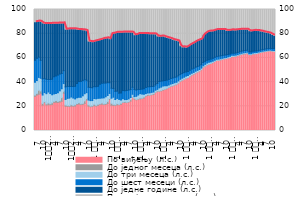
| Category | По виђењу (л.с.) | До једног месеца (л.с.) | До три месеца (л.с.) | До шест месеци (л.с.) | До једне године (л.с.) | Преко једне године (л.с.) |
|---|---|---|---|---|---|---|
| 7 | 28.279 | 1.038 | 10.505 | 18.148 | 31.881 | 10.149 |
| 8 | 29.286 | 1.395 | 10.601 | 18.352 | 30.521 | 9.846 |
| 9 | 29.936 | 3.357 | 10.585 | 16.745 | 29.857 | 9.521 |
| 10 | 30.762 | 1.945 | 10.467 | 14.811 | 32.198 | 9.816 |
| 11 | 20.962 | 1.388 | 6.962 | 13.356 | 46.235 | 11.096 |
| 12 | 23.02 | 0.805 | 7.524 | 11.654 | 45.412 | 11.585 |
| 1
2010. | 21.184 | 0.862 | 8.383 | 11.805 | 46.16 | 11.607 |
| 2 | 21.285 | 1.518 | 9.023 | 10.306 | 46.286 | 11.582 |
| 3 | 21.353 | 0.764 | 8.408 | 11.641 | 46.328 | 11.506 |
| 4 | 21.585 | 1.353 | 6.589 | 12.873 | 46.197 | 11.403 |
| 5 | 23.286 | 0.798 | 6.168 | 14.169 | 44.157 | 11.422 |
| 6 | 23.341 | 1.493 | 5.771 | 14.416 | 43.569 | 11.41 |
| 7 | 23.266 | 0.792 | 7.141 | 14.603 | 42.947 | 11.251 |
| 8 | 23.556 | 1.062 | 8.13 | 13.918 | 42.118 | 11.216 |
| 9 | 24.199 | 2.96 | 7.335 | 12.68 | 41.657 | 11.169 |
| 10 | 30.781 | 1.657 | 6.345 | 10.666 | 39.535 | 11.016 |
| 11 | 20.049 | 1.06 | 4.561 | 10.389 | 47.655 | 16.287 |
| 12 | 20.06 | 0.573 | 5.917 | 9.959 | 47.405 | 16.085 |
| 1
2011. | 19.864 | 0.622 | 6.295 | 9.608 | 47.67 | 15.943 |
| 2 | 20.198 | 1.13 | 6.365 | 8.725 | 47.77 | 15.812 |
| 3 | 20.171 | 0.597 | 6.052 | 9.5 | 47.72 | 15.959 |
| 4 | 20.249 | 1.04 | 4.829 | 10.403 | 47.516 | 15.964 |
| 5 | 21.789 | 0.608 | 4.643 | 11.827 | 44.827 | 16.306 |
| 6 | 21.864 | 1.087 | 4.495 | 12.991 | 43.019 | 16.542 |
| 7 | 21.462 | 0.601 | 5.41 | 13.112 | 42.852 | 16.563 |
| 8 | 21.665 | 0.725 | 6.276 | 12.588 | 41.999 | 16.746 |
| 9 | 22.386 | 2.094 | 5.892 | 11.627 | 41.128 | 16.873 |
| 10 | 25.216 | 1.101 | 4.966 | 10.237 | 41.045 | 17.434 |
| 11 | 20.208 | 0.983 | 4.029 | 10.56 | 38.134 | 26.086 |
| 12 | 19.658 | 0.578 | 4.46 | 10.797 | 38.104 | 26.404 |
| 1 
2012. | 19.907 | 0.608 | 4.223 | 10.568 | 38.056 | 26.639 |
| 2 | 20.572 | 1.122 | 4.734 | 9.87 | 37.577 | 26.124 |
| 3 | 20.284 | 0.534 | 5.362 | 10.002 | 38.101 | 25.718 |
| 4 | 20.768 | 0.945 | 4.856 | 9.95 | 38.185 | 25.295 |
| 5 | 21.629 | 0.577 | 4.354 | 11.593 | 36.949 | 24.898 |
| 6 | 21.75 | 0.97 | 4.139 | 12.16 | 36.576 | 24.405 |
| 7 | 21.485 | 0.49 | 4.995 | 12.244 | 36.94 | 23.846 |
| 8 | 21.733 | 0.557 | 5.563 | 11.377 | 37.125 | 23.645 |
| 9 | 22.222 | 1.811 | 4.936 | 10.592 | 37.123 | 23.316 |
| 10 | 25.476 | 0.944 | 4.219 | 8.814 | 36.435 | 24.113 |
| 11 | 20.881 | 1.621 | 4.204 | 8.286 | 45.097 | 19.91 |
| 12 | 20.858 | 0.731 | 5.932 | 7.128 | 45.736 | 19.615 |
| 1 
2013. | 20.737 | 0.565 | 4.294 | 6.818 | 48.375 | 19.212 |
| 2 | 21.204 | 0.96 | 4.37 | 5.992 | 48.758 | 18.717 |
| 3 | 21.305 | 0.325 | 4.069 | 5.17 | 50.362 | 18.769 |
| 4 | 21.693 | 0.817 | 2.603 | 5.87 | 50.235 | 18.783 |
| 5 | 23.119 | 0.344 | 2.818 | 6.719 | 48.34 | 18.659 |
| 6 | 23.137 | 0.718 | 1.679 | 7.299 | 48.555 | 18.612 |
| 7 | 23.107 | 0.293 | 2.176 | 7.54 | 48.274 | 18.61 |
| 8 | 23.52 | 0.34 | 2.301 | 7.279 | 47.924 | 18.636 |
| 9 | 24.363 | 1.152 | 1.732 | 6.569 | 47.55 | 18.634 |
| 10 | 27.356 | 0.392 | 2.215 | 5.774 | 45.502 | 18.762 |
| 11 | 25.948 | 0.715 | 1.345 | 5.92 | 45.242 | 20.83 |
| 12 | 25.37 | 0.319 | 2.601 | 5.127 | 45.894 | 20.689 |
| 1 
2014. | 25.869 | 0.361 | 3.108 | 4.594 | 46.159 | 19.909 |
| 2 | 26.133 | 0.751 | 3.572 | 3.503 | 46.21 | 19.831 |
| 3 | 26.551 | 0.241 | 3.313 | 4.094 | 46.059 | 19.741 |
| 4 | 26.928 | 0.7 | 2.241 | 4.59 | 45.761 | 19.78 |
| 5 | 28.507 | 0.29 | 1.727 | 5.042 | 44.545 | 19.889 |
| 6 | 29.054 | 0.667 | 1.288 | 5.066 | 44.005 | 19.92 |
| 7 | 29.14 | 0.245 | 1.706 | 5.086 | 43.792 | 20.03 |
| 8 | 29.562 | 0.267 | 1.693 | 4.835 | 43.626 | 20.015 |
| 9 | 29.811 | 0.707 | 1.315 | 4.603 | 43.465 | 20.099 |
| 10 | 31.444 | 0.3 | 1.557 | 4.319 | 42.205 | 20.176 |
| 11 | 32.206 | 0.591 | 1.203 | 4.842 | 39.287 | 21.871 |
| 12 | 32.399 | 0.323 | 2.472 | 5.229 | 37.493 | 22.085 |
| 1 
2015. | 32.776 | 0.327 | 2.767 | 4.926 | 37.211 | 21.992 |
| 2 | 33.359 | 0.567 | 2.829 | 4.301 | 37.006 | 21.937 |
| 3 | 33.99 | 0.292 | 2.651 | 4.454 | 36.066 | 22.547 |
| 4 | 34.508 | 0.463 | 2.004 | 4.644 | 35.341 | 23.04 |
| 5 | 35.565 | 0.236 | 1.784 | 4.62 | 34.299 | 23.496 |
| 6 | 36.367 | 0.381 | 1.599 | 4.578 | 33.147 | 23.928 |
| 7 | 36.903 | 0.206 | 1.757 | 4.512 | 31.952 | 24.671 |
| 8 | 37.509 | 0.231 | 1.699 | 4.52 | 30.918 | 25.123 |
| 9 | 37.942 | 0.382 | 1.533 | 4.369 | 30.259 | 25.515 |
| 10 | 39.154 | 0.187 | 1.657 | 4.191 | 28.805 | 26.006 |
| 11 | 40.593 | 0.298 | 1.431 | 4.004 | 23.741 | 29.933 |
| 12 | 41.548 | 0.189 | 1.525 | 3.885 | 21.934 | 30.919 |
| 1 
2016. | 42.343 | 0.17 | 1.53 | 3.828 | 21.288 | 30.842 |
| 2 | 43.009 | 0.316 | 1.604 | 3.436 | 20.523 | 31.112 |
| 3 | 43.588 | 0.177 | 1.7 | 3.384 | 20.886 | 30.264 |
| 4 | 44.708 | 0.278 | 1.515 | 3.314 | 21.114 | 29.071 |
| 5 | 45.819 | 0.165 | 1.348 | 3.428 | 21.029 | 28.212 |
| 6 | 46.561 | 0.297 | 1.163 | 3.362 | 21.188 | 27.429 |
| 7 | 47.584 | 0.122 | 1.27 | 3.287 | 21.382 | 26.355 |
| 8 | 48.325 | 0.152 | 1.222 | 3.151 | 21.605 | 25.546 |
| 9 | 49.043 | 0.244 | 1.101 | 3.002 | 21.652 | 24.958 |
| 10 | 50.242 | 0.137 | 1.178 | 2.884 | 21.363 | 24.195 |
| 11 | 52.211 | 0.216 | 1.052 | 2.773 | 22.748 | 21.001 |
| 12 | 53.228 | 0.122 | 1.317 | 2.492 | 23.276 | 19.565 |
| 1 
2017. | 54.174 | 0.164 | 1.382 | 2.327 | 23.49 | 18.463 |
| 2 | 54.735 | 0.225 | 1.397 | 2.134 | 23.615 | 17.893 |
| 3 | 55.338 | 0.122 | 1.282 | 2.253 | 23.195 | 17.81 |
| 4 | 56.049 | 0.176 | 1.075 | 2.294 | 22.798 | 17.607 |
| 5 | 56.998 | 0.141 | 0.919 | 2.385 | 22.51 | 17.047 |
| 6 | 57.812 | 0.162 | 0.865 | 2.356 | 22.251 | 16.554 |
| 7 | 57.993 | 0.117 | 0.897 | 2.398 | 22.094 | 16.502 |
| 8 | 58.343 | 0.126 | 0.869 | 2.321 | 21.844 | 16.497 |
| 9 | 58.714 | 0.157 | 0.814 | 2.262 | 21.578 | 16.475 |
| 10 | 59.205 | 0.105 | 0.835 | 2.149 | 21.272 | 16.434 |
| 11 | 59.423 | 0.16 | 0.764 | 2.08 | 20.374 | 17.199 |
| 12 | 59.93 | 0.086 | 0.921 | 1.903 | 19.881 | 17.279 |
| 1 
2018. | 60.256 | 0.103 | 0.99 | 1.776 | 19.785 | 17.091 |
| 2 | 61.003 | 0.16 | 0.991 | 1.636 | 19.512 | 16.698 |
| 3 | 61.126 | 0.091 | 0.928 | 1.69 | 19.272 | 16.893 |
| 4 | 61.39 | 0.125 | 0.817 | 1.721 | 19.134 | 16.813 |
| 5 | 61.913 | 0.089 | 0.708 | 1.771 | 18.908 | 16.612 |
| 6 | 62.386 | 0.245 | 0.663 | 1.731 | 18.528 | 16.447 |
| 7 | 62.786 | 0.314 | 0.679 | 1.714 | 18.204 | 16.303 |
| 8 | 63.092 | 0.428 | 0.659 | 1.682 | 17.815 | 16.324 |
| 9 | 63.331 | 0.478 | 0.629 | 1.669 | 17.604 | 16.288 |
| 10 | 63.547 | 0.496 | 0.663 | 1.642 | 17.363 | 16.288 |
| 11 | 62.689 | 0.114 | 0.61 | 1.606 | 17.471 | 17.51 |
| 12 | 62.615 | 0.076 | 0.762 | 1.486 | 17.358 | 17.703 |
| 1 
2019. | 63.262 | 0.077 | 0.785 | 1.389 | 17.103 | 17.384 |
| 2 | 63.366 | 0.103 | 0.884 | 1.302 | 17.144 | 17.201 |
| 3 | 63.583 | 0.068 | 0.782 | 1.332 | 16.852 | 17.383 |
| 4 | 64.084 | 0.09 | 0.679 | 1.364 | 16.336 | 17.447 |
| 5 | 64.542 | 0.08 | 0.546 | 1.4 | 15.661 | 17.769 |
| 6 | 64.898 | 0.1 | 0.527 | 1.377 | 15.022 | 18.077 |
| 7 | 65.165 | 0.075 | 0.538 | 1.349 | 14.354 | 18.519 |
| 8 | 65.425 | 0.077 | 0.527 | 1.415 | 13.697 | 18.859 |
| 9 | 65.727 | 0.102 | 0.485 | 1.388 | 13.127 | 19.17 |
| 10 | 65.887 | 0.07 | 0.516 | 1.395 | 12.525 | 19.607 |
| 11 | 65.607 | 0.087 | 0.517 | 1.507 | 11.619 | 20.663 |
| 12 | 65.51 | 0.067 | 0.517 | 1.583 | 11.029 | 21.294 |